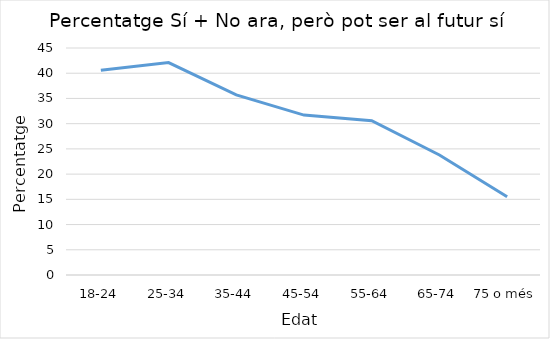
| Category | Series 0 |
|---|---|
| 18-24 | 40.6 |
| 25-34 | 42.1 |
| 35-44 | 35.7 |
| 45-54 | 31.7 |
| 55-64 | 30.6 |
| 65-74 | 23.8 |
| 75 o més | 15.5 |